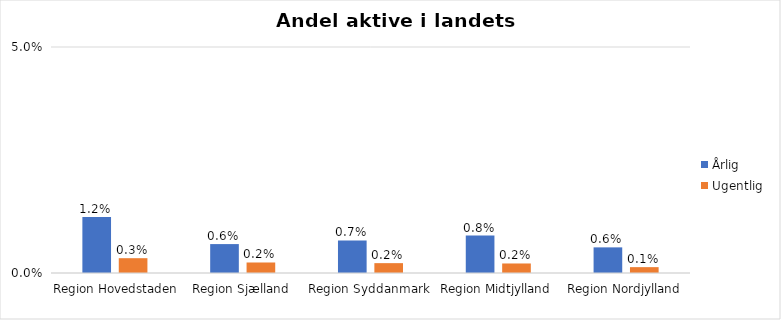
| Category | Årlig | Ugentlig |
|---|---|---|
| Region Hovedstaden | 0.012 | 0.003 |
| Region Sjælland | 0.006 | 0.002 |
| Region Syddanmark | 0.007 | 0.002 |
| Region Midtjylland | 0.008 | 0.002 |
| Region Nordjylland | 0.006 | 0.001 |